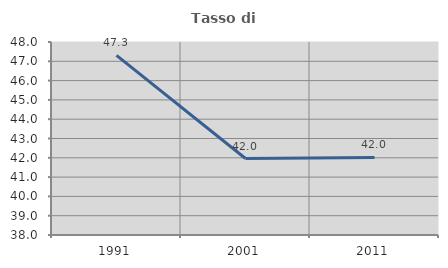
| Category | Tasso di occupazione   |
|---|---|
| 1991.0 | 47.305 |
| 2001.0 | 41.962 |
| 2011.0 | 42.022 |